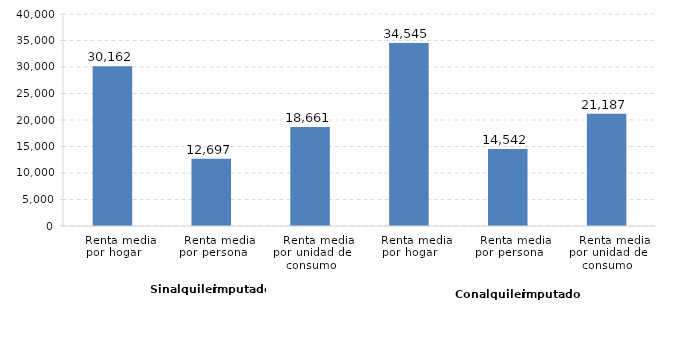
| Category | La Rioja |
|---|---|
|    Renta media por hogar | 30162 |
|    Renta media por persona | 12697 |
|    Renta media por unidad de consumo | 18661 |
|    Renta media por hogar | 34545 |
|    Renta media por persona | 14542 |
|    Renta media por unidad de consumo | 21187 |